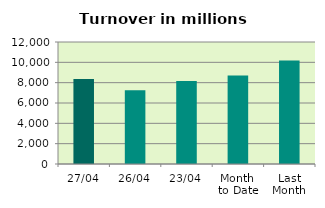
| Category | Series 0 |
|---|---|
| 27/04 | 8359.318 |
| 26/04 | 7257.566 |
| 23/04 | 8161.75 |
| Month 
to Date | 8698.677 |
| Last
Month | 10188.955 |